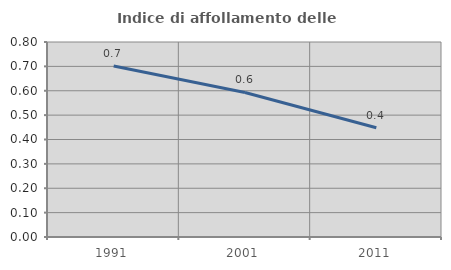
| Category | Indice di affollamento delle abitazioni  |
|---|---|
| 1991.0 | 0.701 |
| 2001.0 | 0.593 |
| 2011.0 | 0.448 |